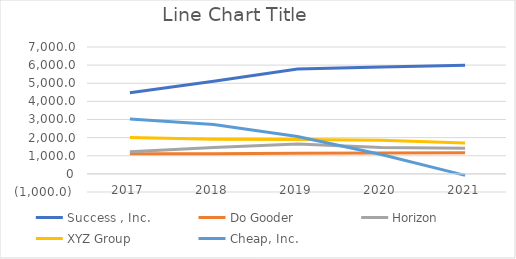
| Category | Success , Inc. | Do Gooder | Horizon | XYZ Group | Cheap, Inc. |
|---|---|---|---|---|---|
| 2017.0 | 4478 | 1104.8 | 1218 | 2003.61 | 3021.7 |
| 2018.0 | 5107 | 1108.5 | 1452 | 1905.22 | 2729.9 |
| 2019.0 | 5781 | 1136.9 | 1653 | 1902.58 | 2056.5 |
| 2020.0 | 5900 | 1149.4 | 1453 | 1853.75 | 1070.9 |
| 2021.0 | 5990 | 1170.5 | 1411 | 1704.51 | -84.2 |